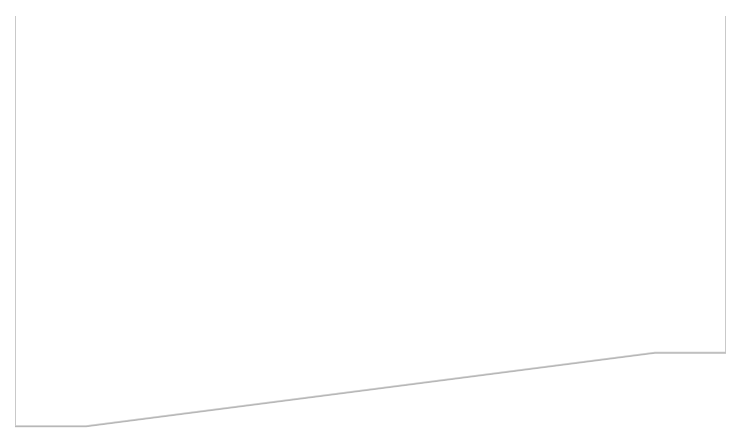
| Category | Series 0 | Series 1 | Series 2 |
|---|---|---|---|
| 0.0 | 3958.639 | 4.688 | 49.833 |
| 10.0 | 3958.639 | 4.688 | 49.833 |
| 90.0 | 3249.727 | 4.688 | 758.746 |
| 100.0 | 3249.727 | 4.688 | 758.746 |